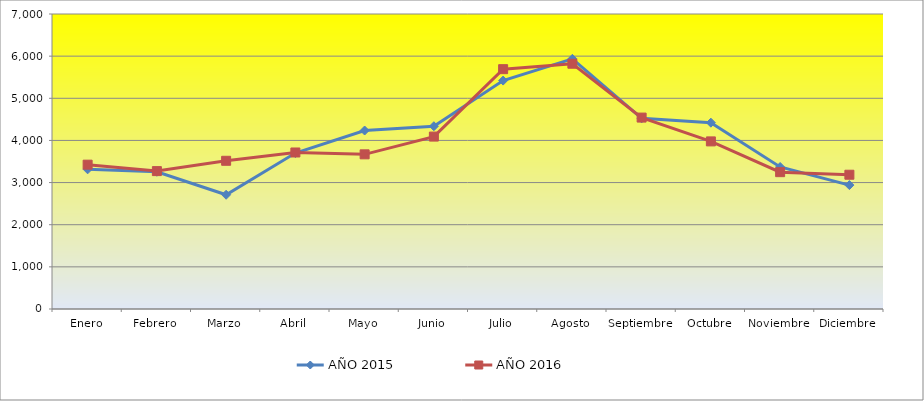
| Category | AÑO 2015 | AÑO 2016 |
|---|---|---|
| Enero | 3314 | 3425 |
| Febrero | 3257 | 3272 |
| Marzo | 2711 | 3517 |
| Abril | 3700 | 3714 |
| Mayo | 4235 | 3670 |
| Junio | 4337 | 4091 |
| Julio | 5420 | 5691 |
| Agosto | 5936 | 5820 |
| Septiembre | 4524 | 4542 |
| Octubre | 4421 | 3977 |
| Noviembre | 3370 | 3247 |
| Diciembre | 2940 | 3186 |